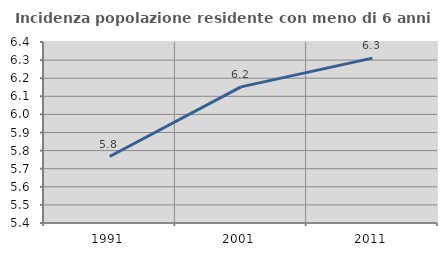
| Category | Incidenza popolazione residente con meno di 6 anni |
|---|---|
| 1991.0 | 5.767 |
| 2001.0 | 6.152 |
| 2011.0 | 6.311 |